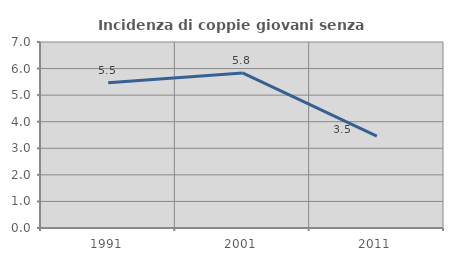
| Category | Incidenza di coppie giovani senza figli |
|---|---|
| 1991.0 | 5.47 |
| 2001.0 | 5.836 |
| 2011.0 | 3.454 |